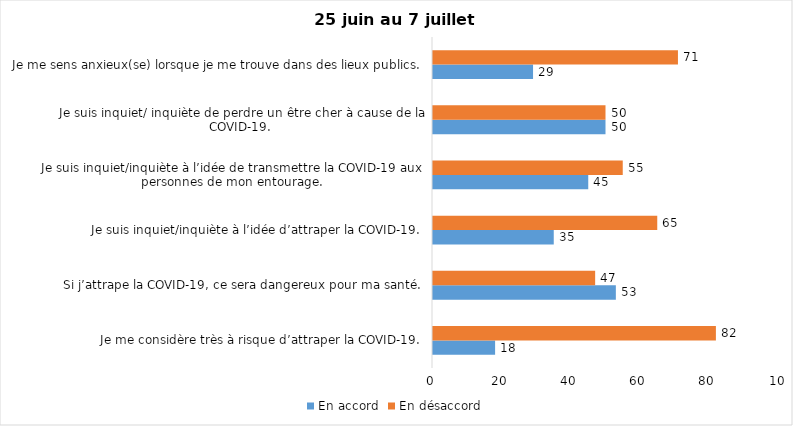
| Category | En accord | En désaccord |
|---|---|---|
| Je me considère très à risque d’attraper la COVID-19. | 18 | 82 |
| Si j’attrape la COVID-19, ce sera dangereux pour ma santé. | 53 | 47 |
| Je suis inquiet/inquiète à l’idée d’attraper la COVID-19. | 35 | 65 |
| Je suis inquiet/inquiète à l’idée de transmettre la COVID-19 aux personnes de mon entourage. | 45 | 55 |
| Je suis inquiet/ inquiète de perdre un être cher à cause de la COVID-19. | 50 | 50 |
| Je me sens anxieux(se) lorsque je me trouve dans des lieux publics. | 29 | 71 |